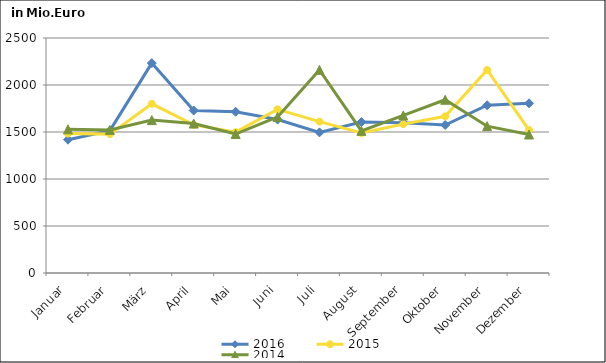
| Category | 2016 | 2015 | 2014 |
|---|---|---|---|
| Januar | 1418.081 | 1483.329 | 1528.411 |
| Februar | 1514.211 | 1477.46 | 1522.527 |
| März | 2232.937 | 1800.029 | 1626.661 |
| April | 1728.624 | 1576.293 | 1589.917 |
| Mai | 1715.398 | 1498.124 | 1478.314 |
| Juni | 1632.803 | 1741.269 | 1659.563 |
| Juli | 1496.062 | 1610.203 | 2160.552 |
| August | 1605.52 | 1488.872 | 1512.039 |
| September | 1598.355 | 1583.92 | 1676.139 |
| Oktober | 1574.617 | 1666.689 | 1842.815 |
| November | 1784.503 | 2159.616 | 1561.962 |
| Dezember | 1805.169 | 1520.186 | 1473.459 |